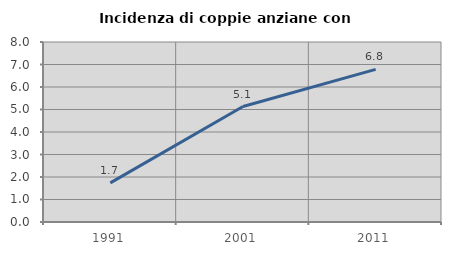
| Category | Incidenza di coppie anziane con figli |
|---|---|
| 1991.0 | 1.737 |
| 2001.0 | 5.132 |
| 2011.0 | 6.781 |